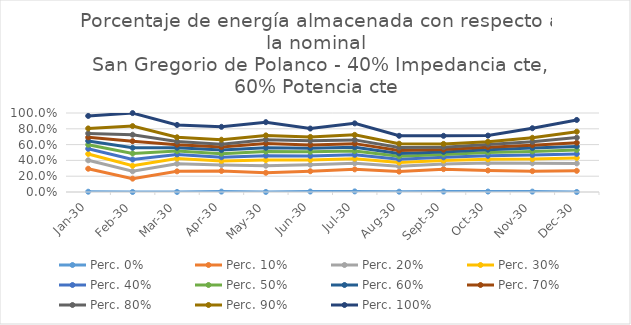
| Category | Perc. 0% | Perc. 10% | Perc. 20% | Perc. 30% | Perc. 40% | Perc. 50% | Perc. 60% | Perc. 70% | Perc. 80% | Perc. 90% | Perc. 100% |
|---|---|---|---|---|---|---|---|---|---|---|---|
| 2030-01-01 | 0.003 | 0.295 | 0.401 | 0.482 | 0.547 | 0.598 | 0.646 | 0.692 | 0.741 | 0.804 | 0.963 |
| 2030-02-01 | 0 | 0.169 | 0.262 | 0.332 | 0.411 | 0.488 | 0.56 | 0.643 | 0.725 | 0.834 | 0.999 |
| 2030-03-01 | 0.001 | 0.261 | 0.358 | 0.424 | 0.476 | 0.518 | 0.56 | 0.599 | 0.638 | 0.693 | 0.849 |
| 2030-04-01 | 0.005 | 0.266 | 0.342 | 0.394 | 0.44 | 0.484 | 0.531 | 0.568 | 0.606 | 0.662 | 0.825 |
| 2030-05-01 | 0.001 | 0.243 | 0.333 | 0.404 | 0.46 | 0.511 | 0.559 | 0.613 | 0.662 | 0.717 | 0.884 |
| 2030-06-01 | 0.006 | 0.263 | 0.346 | 0.407 | 0.456 | 0.509 | 0.554 | 0.596 | 0.648 | 0.697 | 0.803 |
| 2030-07-01 | 0.007 | 0.286 | 0.363 | 0.422 | 0.471 | 0.518 | 0.566 | 0.612 | 0.66 | 0.723 | 0.869 |
| 2030-08-01 | 0.004 | 0.258 | 0.325 | 0.373 | 0.415 | 0.452 | 0.488 | 0.525 | 0.562 | 0.611 | 0.711 |
| 2030-09-01 | 0.006 | 0.289 | 0.354 | 0.397 | 0.439 | 0.476 | 0.507 | 0.537 | 0.567 | 0.609 | 0.711 |
| 2030-10-01 | 0.006 | 0.272 | 0.366 | 0.414 | 0.458 | 0.5 | 0.535 | 0.567 | 0.6 | 0.636 | 0.714 |
| 2030-11-01 | 0.005 | 0.264 | 0.364 | 0.416 | 0.468 | 0.514 | 0.557 | 0.592 | 0.635 | 0.686 | 0.807 |
| 2030-12-01 | 0 | 0.268 | 0.362 | 0.432 | 0.482 | 0.532 | 0.577 | 0.624 | 0.689 | 0.764 | 0.912 |